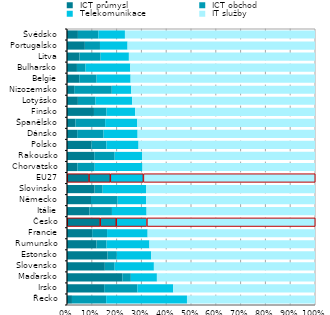
| Category |  ICT průmysl |  ICT obchod |  Telekomunikace |  IT služby |
|---|---|---|---|---|
| Řecko | 0.02 | 0.138 | 0.326 | 0.516 |
| Irsko | 0.15 | 0.134 | 0.144 | 0.572 |
| Maďarsko | 0.223 | 0.034 | 0.105 | 0.637 |
| Slovensko | 0.153 | 0.04 | 0.158 | 0.65 |
| Estonsko | 0.163 | 0.038 | 0.139 | 0.66 |
| Rumunsko | 0.119 | 0.041 | 0.173 | 0.668 |
| Francie | 0.101 | 0.06 | 0.164 | 0.675 |
| Česko | 0.133 | 0.065 | 0.123 | 0.679 |
| Itálie | 0.091 | 0.091 | 0.14 | 0.679 |
| Německo | 0.097 | 0.107 | 0.115 | 0.681 |
| Slovinsko | 0.111 | 0.033 | 0.175 | 0.681 |
| EU27 | 0.088 | 0.086 | 0.133 | 0.693 |
| Chorvatsko | 0.042 | 0.07 | 0.193 | 0.696 |
| Rakousko | 0.11 | 0.082 | 0.111 | 0.696 |
| Polsko | 0.098 | 0.061 | 0.13 | 0.711 |
| Dánsko | 0.041 | 0.107 | 0.137 | 0.715 |
| Španělsko | 0.034 | 0.12 | 0.13 | 0.717 |
| Finsko | 0.109 | 0.051 | 0.116 | 0.725 |
| Lotyšsko | 0.044 | 0.071 | 0.148 | 0.737 |
| Nizozemsko | 0.029 | 0.152 | 0.079 | 0.741 |
| Belgie | 0.049 | 0.07 | 0.137 | 0.743 |
| Bulharsko | 0.04 | 0.035 | 0.18 | 0.745 |
| Litva | 0.05 | 0.085 | 0.114 | 0.75 |
| Portugalsko | 0.072 | 0.061 | 0.111 | 0.756 |
| Švédsko | 0.044 | 0.083 | 0.107 | 0.766 |